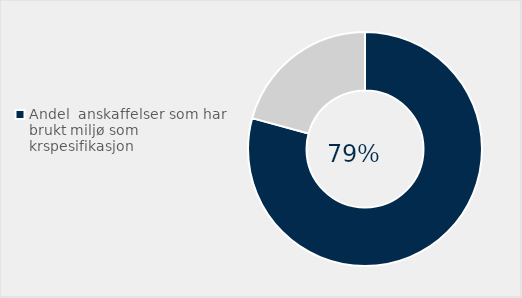
| Category | Series 0 |
|---|---|
| Andel  anskaffelser som har brukt miljø som krspesifikasjon | 0.792 |
| Ikke brukt miljø  som kravspesifikasjon | 0.208 |